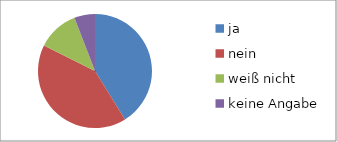
| Category | Series 0 |
|---|---|
| ja | 7 |
| nein | 7 |
| weiß nicht | 2 |
| keine Angabe | 1 |